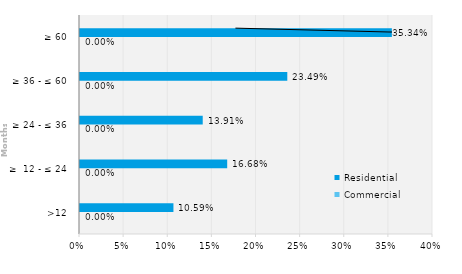
| Category | Commercial | Residential |
|---|---|---|
| >12 | 0 | 0.106 |
| ≥  12 - ≤ 24 | 0 | 0.167 |
| ≥ 24 - ≤ 36 | 0 | 0.139 |
| ≥ 36 - ≤ 60 | 0 | 0.235 |
| ≥ 60 | 0 | 0.353 |